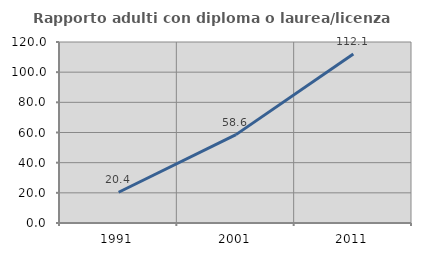
| Category | Rapporto adulti con diploma o laurea/licenza media  |
|---|---|
| 1991.0 | 20.388 |
| 2001.0 | 58.594 |
| 2011.0 | 112.069 |